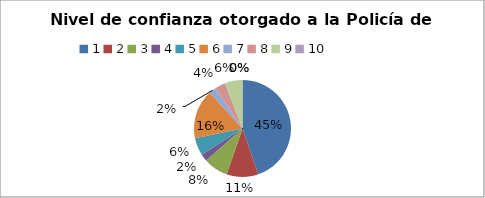
| Category | Series 0 |
|---|---|
| 0 | 0.447 |
| 1 | 0.106 |
| 2 | 0.082 |
| 3 | 0.024 |
| 4 | 0.059 |
| 5 | 0.165 |
| 6 | 0.024 |
| 7 | 0.035 |
| 8 | 0.059 |
| 9 | 0 |
| 10 | 0 |